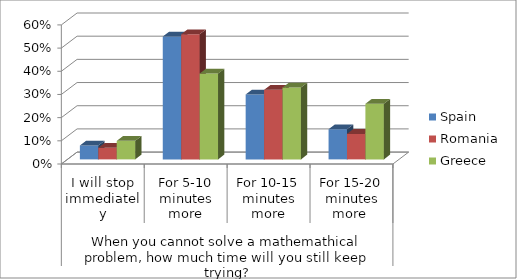
| Category | Spain  | Romania | Greece |
|---|---|---|---|
| 0 | 0.06 | 0.05 | 0.08 |
| 1 | 0.53 | 0.54 | 0.37 |
| 2 | 0.28 | 0.3 | 0.31 |
| 3 | 0.13 | 0.11 | 0.24 |